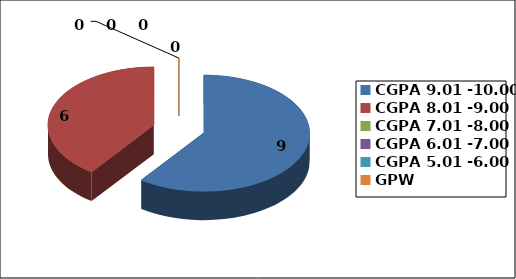
| Category | Series 0 |
|---|---|
| CGPA 9.01 -10.00 | 9 |
| CGPA 8.01 -9.00 | 6 |
| CGPA 7.01 -8.00 | 0 |
| CGPA 6.01 -7.00 | 0 |
| CGPA 5.01 -6.00 | 0 |
| GPW | 0 |